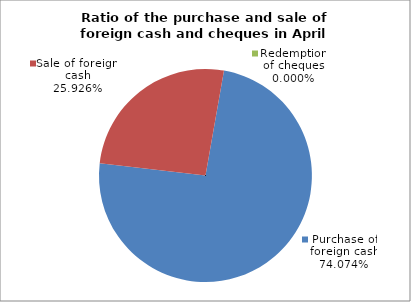
| Category | Purchase of foreign cash |
|---|---|
| 0 | 0.741 |
| 1 | 0.259 |
| 2 | 0 |